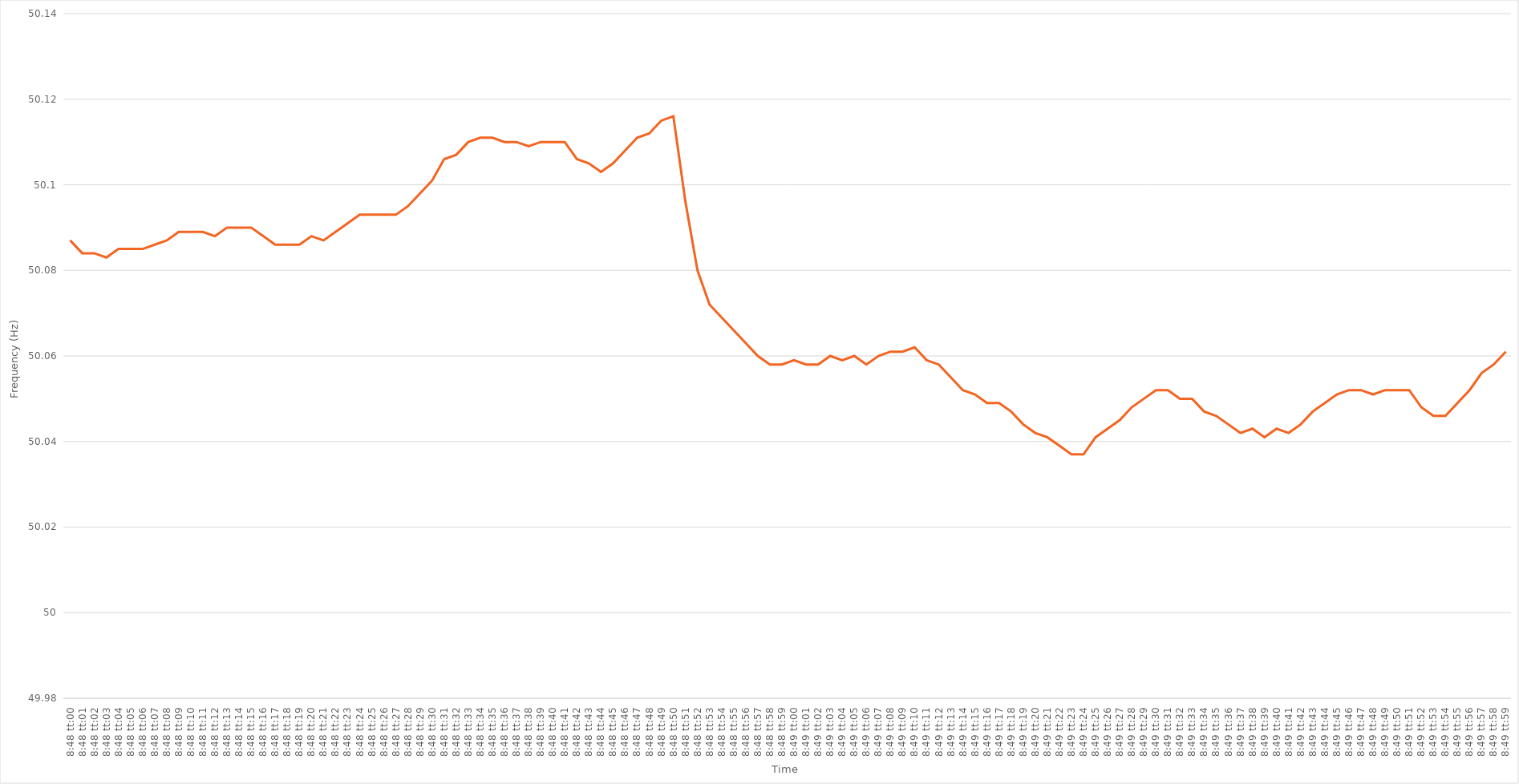
| Category | Series 0 |
|---|---|
| 0.3666666666666667 | 50.087 |
| 0.36667824074074074 | 50.084 |
| 0.36668981481481483 | 50.084 |
| 0.36670138888888887 | 50.083 |
| 0.366712962962963 | 50.085 |
| 0.36672453703703706 | 50.085 |
| 0.3667361111111111 | 50.085 |
| 0.3667476851851852 | 50.086 |
| 0.36675925925925923 | 50.087 |
| 0.3667708333333333 | 50.089 |
| 0.36678240740740736 | 50.089 |
| 0.3667939814814815 | 50.089 |
| 0.36680555555555555 | 50.088 |
| 0.36681712962962965 | 50.09 |
| 0.3668287037037037 | 50.09 |
| 0.3668402777777778 | 50.09 |
| 0.3668518518518518 | 50.088 |
| 0.36686342592592597 | 50.086 |
| 0.366875 | 50.086 |
| 0.3668865740740741 | 50.086 |
| 0.36689814814814814 | 50.088 |
| 0.36690972222222223 | 50.087 |
| 0.3669212962962963 | 50.089 |
| 0.3669328703703704 | 50.091 |
| 0.36694444444444446 | 50.093 |
| 0.3669560185185185 | 50.093 |
| 0.3669675925925926 | 50.093 |
| 0.36697916666666663 | 50.093 |
| 0.36699074074074073 | 50.095 |
| 0.36700231481481477 | 50.098 |
| 0.3670138888888889 | 50.101 |
| 0.36702546296296296 | 50.106 |
| 0.36703703703703705 | 50.107 |
| 0.3670486111111111 | 50.11 |
| 0.3670601851851852 | 50.111 |
| 0.3670717592592592 | 50.111 |
| 0.3670833333333334 | 50.11 |
| 0.3670949074074074 | 50.11 |
| 0.3671064814814815 | 50.109 |
| 0.36711805555555554 | 50.11 |
| 0.36712962962962964 | 50.11 |
| 0.3671412037037037 | 50.11 |
| 0.36715277777777783 | 50.106 |
| 0.36716435185185187 | 50.105 |
| 0.36717592592592596 | 50.103 |
| 0.3671875 | 50.105 |
| 0.36719907407407404 | 50.108 |
| 0.36721064814814813 | 50.111 |
| 0.36722222222222217 | 50.112 |
| 0.3672337962962963 | 50.115 |
| 0.36724537037037036 | 50.116 |
| 0.36725694444444446 | 50.096 |
| 0.3672685185185185 | 50.08 |
| 0.3672800925925926 | 50.072 |
| 0.3672916666666666 | 50.069 |
| 0.3673032407407408 | 50.066 |
| 0.3673148148148148 | 50.063 |
| 0.3673263888888889 | 50.06 |
| 0.36733796296296295 | 50.058 |
| 0.36734953703703704 | 50.058 |
| 0.3673611111111111 | 50.059 |
| 0.36737268518518523 | 50.058 |
| 0.36738425925925927 | 50.058 |
| 0.36739583333333337 | 50.06 |
| 0.3674074074074074 | 50.059 |
| 0.3674189814814815 | 50.06 |
| 0.36743055555555554 | 50.058 |
| 0.3674421296296296 | 50.06 |
| 0.3674537037037037 | 50.061 |
| 0.36746527777777777 | 50.061 |
| 0.36747685185185186 | 50.062 |
| 0.3674884259259259 | 50.059 |
| 0.3675 | 50.058 |
| 0.36751157407407403 | 50.055 |
| 0.3675231481481482 | 50.052 |
| 0.3675347222222222 | 50.051 |
| 0.3675462962962963 | 50.049 |
| 0.36755787037037035 | 50.049 |
| 0.36756944444444445 | 50.047 |
| 0.3675810185185185 | 50.044 |
| 0.36759259259259264 | 50.042 |
| 0.3676041666666667 | 50.041 |
| 0.36761574074074077 | 50.039 |
| 0.3676273148148148 | 50.037 |
| 0.3676388888888889 | 50.037 |
| 0.36765046296296294 | 50.041 |
| 0.367662037037037 | 50.043 |
| 0.36767361111111113 | 50.045 |
| 0.36768518518518517 | 50.048 |
| 0.36769675925925926 | 50.05 |
| 0.3677083333333333 | 50.052 |
| 0.3677199074074074 | 50.052 |
| 0.36773148148148144 | 50.05 |
| 0.3677430555555556 | 50.05 |
| 0.3677546296296296 | 50.047 |
| 0.3677662037037037 | 50.046 |
| 0.36777777777777776 | 50.044 |
| 0.36778935185185185 | 50.042 |
| 0.3678009259259259 | 50.043 |
| 0.36781250000000004 | 50.041 |
| 0.3678240740740741 | 50.043 |
| 0.3678356481481482 | 50.042 |
| 0.3678472222222222 | 50.044 |
| 0.3678587962962963 | 50.047 |
| 0.36787037037037035 | 50.049 |
| 0.3678819444444445 | 50.051 |
| 0.36789351851851854 | 50.052 |
| 0.3679050925925926 | 50.052 |
| 0.36791666666666667 | 50.051 |
| 0.3679282407407407 | 50.052 |
| 0.3679398148148148 | 50.052 |
| 0.36795138888888884 | 50.052 |
| 0.367962962962963 | 50.048 |
| 0.36797453703703703 | 50.046 |
| 0.3679861111111111 | 50.046 |
| 0.36799768518518516 | 50.049 |
| 0.36800925925925926 | 50.052 |
| 0.3680208333333333 | 50.056 |
| 0.36803240740740745 | 50.058 |
| 0.3680439814814815 | 50.061 |